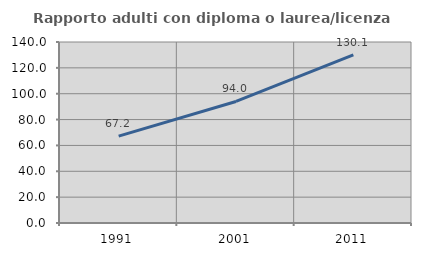
| Category | Rapporto adulti con diploma o laurea/licenza media  |
|---|---|
| 1991.0 | 67.2 |
| 2001.0 | 94.016 |
| 2011.0 | 130.068 |